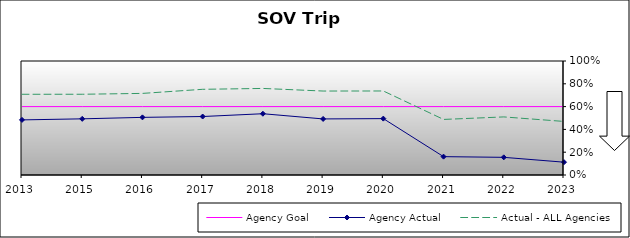
| Category | Agency Goal | Agency Actual | Actual - ALL Agencies |
|---|---|---|---|
| 2013.0 | 0.6 | 0.483 | 0.708 |
| 2015.0 | 0.6 | 0.493 | 0.708 |
| 2016.0 | 0.6 | 0.506 | 0.716 |
| 2017.0 | 0.6 | 0.513 | 0.752 |
| 2018.0 | 0.6 | 0.538 | 0.759 |
| 2019.0 | 0.6 | 0.492 | 0.736 |
| 2020.0 | 0.6 | 0.495 | 0.737 |
| 2021.0 | 0.6 | 0.161 | 0.487 |
| 2022.0 | 0.6 | 0.155 | 0.509 |
| 2023.0 | 0.6 | 0.112 | 0.47 |